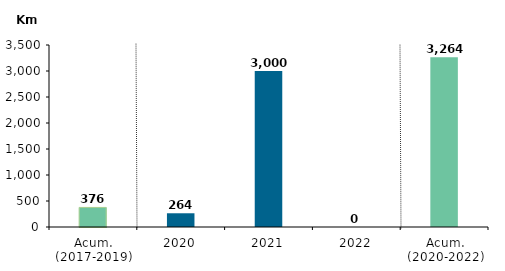
| Category | Series 0 |
|---|---|
| Acum. (2017-2019) | 376.22 |
| 2020 | 264 |
| 2021 | 3000 |
| 2022 | 0 |
| Acum. (2020-2022) | 3264 |